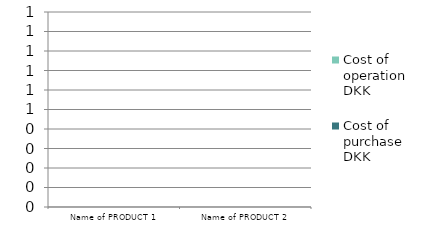
| Category | Cost of purchase DKK | Cost of operation  DKK |
|---|---|---|
| Name of PRODUCT 1 | 0 | 0 |
| Name of PRODUCT 2 | 0 | 0 |